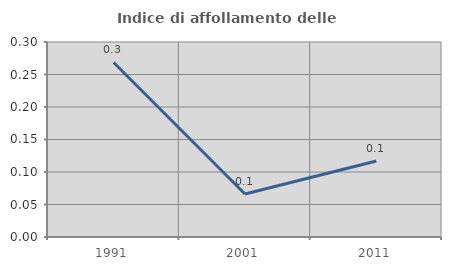
| Category | Indice di affollamento delle abitazioni  |
|---|---|
| 1991.0 | 0.269 |
| 2001.0 | 0.066 |
| 2011.0 | 0.117 |